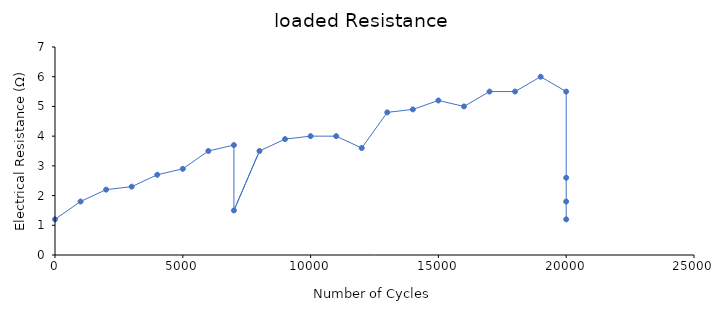
| Category | loaded Resistance |
|---|---|
| 0.0 | 1.2 |
| 1000.0 | 1.8 |
| 2000.0 | 2.2 |
| 3000.0 | 2.3 |
| 4000.0 | 2.7 |
| 5000.0 | 2.9 |
| 6000.0 | 3.5 |
| 7000.0 | 3.7 |
| 7000.0 | 1.5 |
| 8000.0 | 3.5 |
| 9000.0 | 3.9 |
| 10000.0 | 4 |
| 11000.0 | 4 |
| 12000.0 | 3.6 |
| 13000.0 | 4.8 |
| 14000.0 | 4.9 |
| 15000.0 | 5.2 |
| 16000.0 | 5 |
| 17000.0 | 5.5 |
| 18000.0 | 5.5 |
| 19000.0 | 6 |
| 20000.0 | 5.5 |
| 20000.0 | 2.6 |
| 20000.0 | 1.8 |
| 20000.0 | 1.2 |